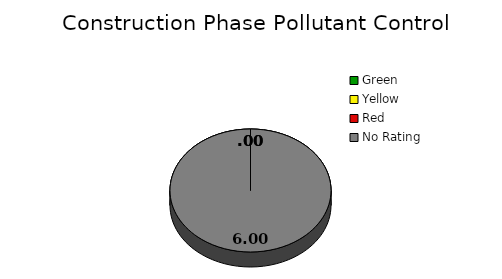
| Category | Counts |
|---|---|
| Green | 0 |
| Yellow | 0 |
| Red | 0 |
| No Rating | 6 |